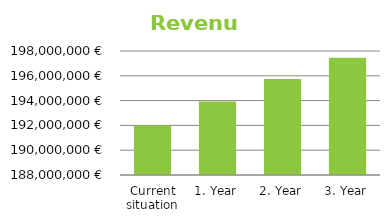
| Category | Series 0 |
|---|---|
| Current situation | 192000000 |
| 1. Year | 193933850.746 |
| 2. Year | 195747685.254 |
| 3. Year | 197459597.824 |